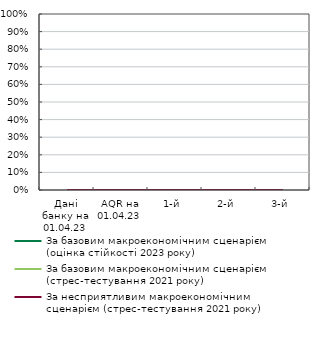
| Category | За базовим макроекономічним сценарієм (оцінка стійкості 2023 року) | За базовим макроекономічним сценарієм (стрес-тестування 2021 року) | За несприятливим макроекономічним сценарієм (стрес-тестування 2021 року) |
|---|---|---|---|
| Дані банку на 01.04.23 | 0 | 0 | 0 |
| AQR на 01.04.23 | 0 | 0 | 0 |
| 1-й | 0 | 0 | 0 |
| 2-й | 0 | 0 | 0 |
| 3-й | 0 | 0 | 0 |